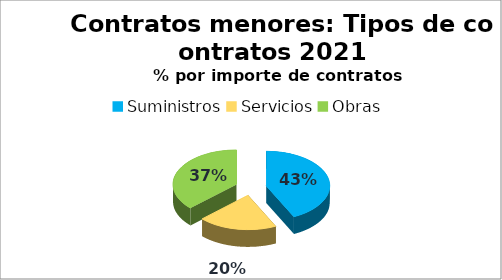
| Category | Series 0 |
|---|---|
| Suministros | 4773602.09 |
| Servicios | 2240963.71 |
| Obras | 4138660.69 |